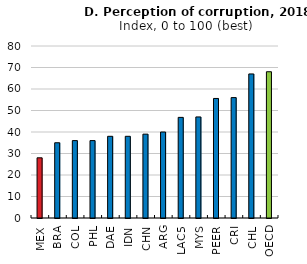
| Category | Series 0 |
|---|---|
| MEX | 28 |
| BRA | 35 |
| COL | 36 |
| PHL | 36 |
| DAE | 38 |
| IDN | 38 |
| CHN | 39 |
| ARG | 40 |
| LAC5 | 46.8 |
| MYS | 47 |
| PEER | 55.6 |
| CRI | 56 |
| CHL | 67 |
| OECD | 68.028 |